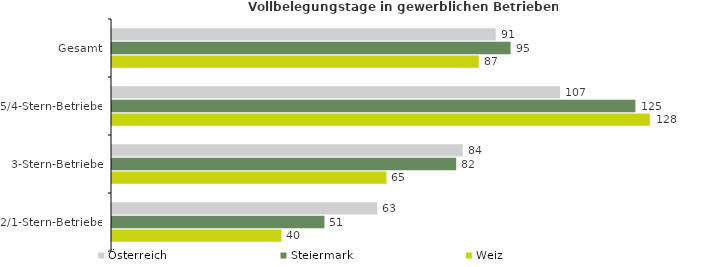
| Category | Österreich | Steiermark | Weiz |
|---|---|---|---|
| Gesamt | 91.375 | 94.907 | 87.324 |
| 5/4-Stern-Betriebe | 106.695 | 124.622 | 128.068 |
| 3-Stern-Betriebe | 83.508 | 81.957 | 65.341 |
| 2/1-Stern-Betriebe | 63.173 | 50.58 | 40.346 |